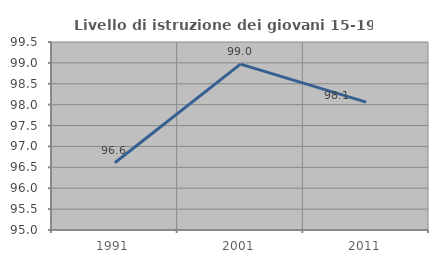
| Category | Livello di istruzione dei giovani 15-19 anni |
|---|---|
| 1991.0 | 96.61 |
| 2001.0 | 98.969 |
| 2011.0 | 98.06 |